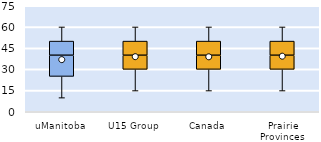
| Category | 25th | 50th | 75th |
|---|---|---|---|
| uManitoba | 25 | 15 | 10 |
| U15 Group | 30 | 10 | 10 |
| Canada | 30 | 10 | 10 |
| Prairie Provinces | 30 | 10 | 10 |